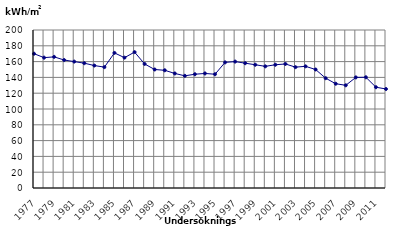
| Category | Elförbrukning, kWh/m2 |
|---|---|
| 1977 | 170 |
| 1978 | 165 |
| 1979 | 166 |
| 1980 | 162 |
| 1981 | 160 |
| 1982 | 158 |
| 1983 | 155 |
| 1984 | 153 |
| 1985 | 171 |
| 1986 | 165 |
| 1987 | 172 |
| 1988 | 157 |
| 1989 | 150 |
| 1990 | 149 |
| 1991 | 145 |
| 1992 | 142 |
| 1993 | 144 |
| 1994 | 145 |
| 1995 | 144 |
| 1996 | 159 |
| 1997 | 160 |
| 1998 | 158 |
| 1999 | 156 |
| 2000 | 154 |
| 2001 | 156 |
| 2002 | 157 |
| 2003 | 153 |
| 2004 | 154 |
| 2005 | 150 |
| 2006 | 139 |
| 2007 | 132 |
| 2008 | 130 |
| 2009 | 140.005 |
| 2010 | 140.154 |
| 2011 | 127.589 |
| 2012 | 125.319 |